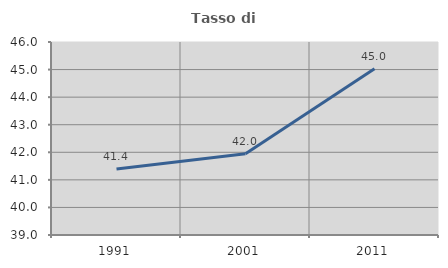
| Category | Tasso di occupazione   |
|---|---|
| 1991.0 | 41.392 |
| 2001.0 | 41.951 |
| 2011.0 | 45.026 |